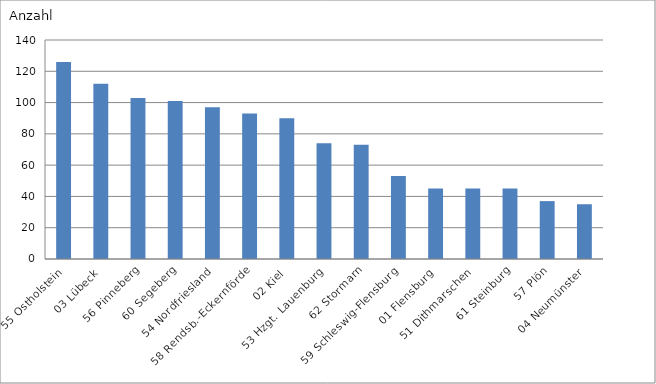
| Category | 55 Ostholstein |
|---|---|
| 55 Ostholstein | 126 |
| 03 Lübeck | 112 |
| 56 Pinneberg | 103 |
| 60 Segeberg | 101 |
| 54 Nordfriesland | 97 |
| 58 Rendsb.-Eckernförde | 93 |
| 02 Kiel | 90 |
| 53 Hzgt. Lauenburg | 74 |
| 62 Stormarn | 73 |
| 59 Schleswig-Flensburg | 53 |
| 01 Flensburg | 45 |
| 51 Dithmarschen | 45 |
| 61 Steinburg | 45 |
| 57 Plön | 37 |
| 04 Neumünster | 35 |